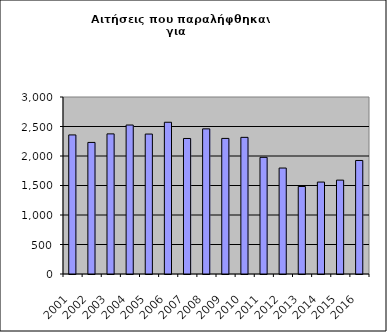
| Category | Series 1 |
|---|---|
| 2001.0 | 2357 |
| 2002.0 | 2230 |
| 2003.0 | 2375 |
| 2004.0 | 2525 |
| 2005.0 | 2372 |
| 2006.0 | 2572 |
| 2007.0 | 2297 |
| 2008.0 | 2460 |
| 2009.0 | 2298 |
| 2010.0 | 2316 |
| 2011.0 | 1977 |
| 2012.0 | 1796 |
| 2013.0 | 1483 |
| 2014.0 | 1558 |
| 2015.0 | 1591 |
| 2016.0 | 1924 |